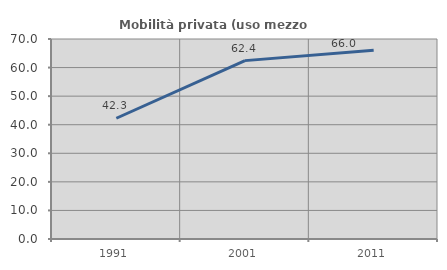
| Category | Mobilità privata (uso mezzo privato) |
|---|---|
| 1991.0 | 42.263 |
| 2001.0 | 62.43 |
| 2011.0 | 66.026 |